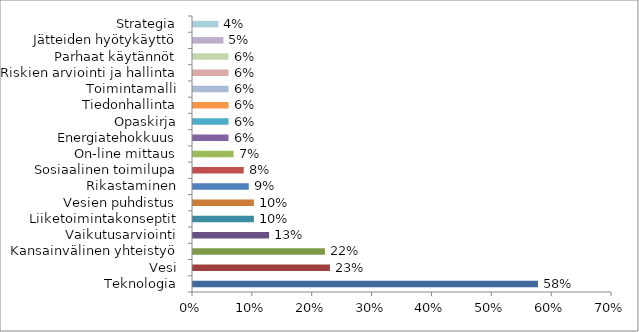
| Category | Series 0 |
|---|---|
| Teknologia | 0.576 |
| Vesi | 0.229 |
| Kansainvälinen yhteistyö | 0.22 |
| Vaikutusarviointi | 0.127 |
| Liiketoimintakonseptit | 0.102 |
| Vesien puhdistus | 0.102 |
| Rikastaminen | 0.093 |
| Sosiaalinen toimilupa | 0.085 |
| On-line mittaus | 0.068 |
| Energiatehokkuus | 0.059 |
| Opaskirja | 0.059 |
| Tiedonhallinta | 0.059 |
| Toimintamalli | 0.059 |
| Riskien arviointi ja hallinta | 0.059 |
| Parhaat käytännöt | 0.059 |
| Jätteiden hyötykäyttö | 0.051 |
| Strategia | 0.042 |